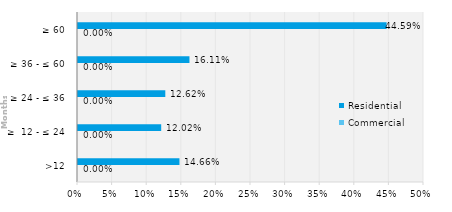
| Category | Commercial | Residential |
|---|---|---|
| >12 | 0 | 0.147 |
| ≥  12 - ≤ 24 | 0 | 0.12 |
| ≥ 24 - ≤ 36 | 0 | 0.126 |
| ≥ 36 - ≤ 60 | 0 | 0.161 |
| ≥ 60 | 0 | 0.446 |